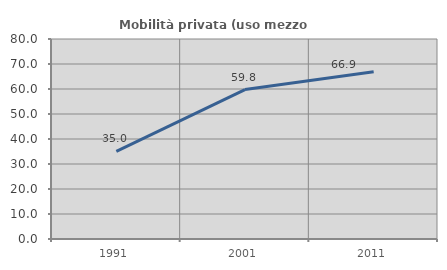
| Category | Mobilità privata (uso mezzo privato) |
|---|---|
| 1991.0 | 35.015 |
| 2001.0 | 59.758 |
| 2011.0 | 66.867 |